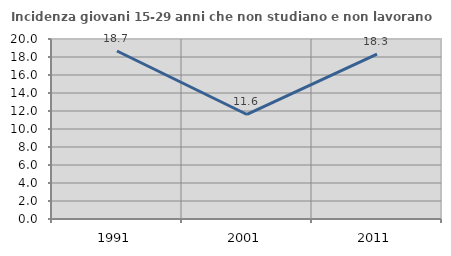
| Category | Incidenza giovani 15-29 anni che non studiano e non lavorano  |
|---|---|
| 1991.0 | 18.667 |
| 2001.0 | 11.613 |
| 2011.0 | 18.328 |